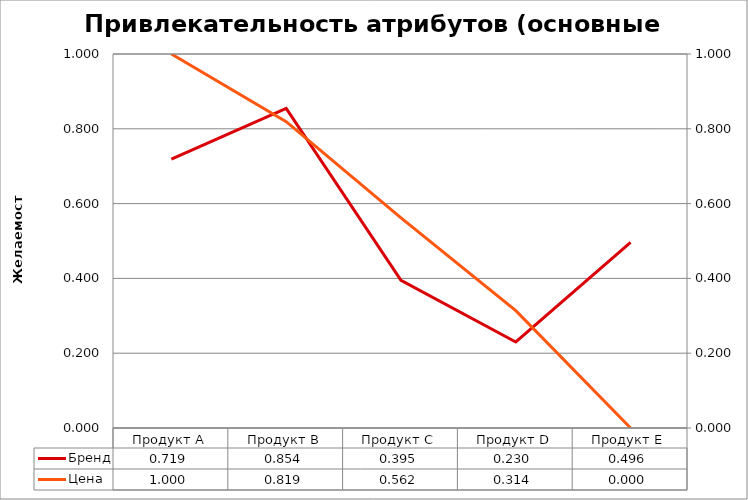
| Category | Бренд |
|---|---|
| Продукт А | 0.719 |
| Продукт В | 0.854 |
| Продукт С | 0.395 |
| Продукт D | 0.23 |
| Продукт Е | 0.496 |